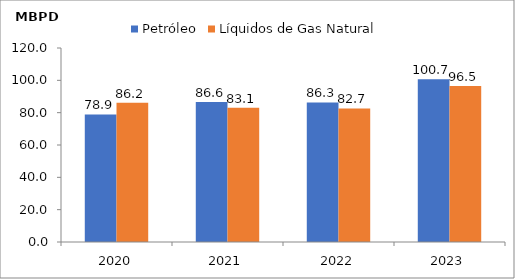
| Category | Petróleo | Líquidos de Gas Natural |
|---|---|---|
| 2020.0 | 78.874 | 86.171 |
| 2021.0 | 86.623 | 83.051 |
| 2022.0 | 86.331 | 82.653 |
| 2023.0 | 100.718 | 96.495 |